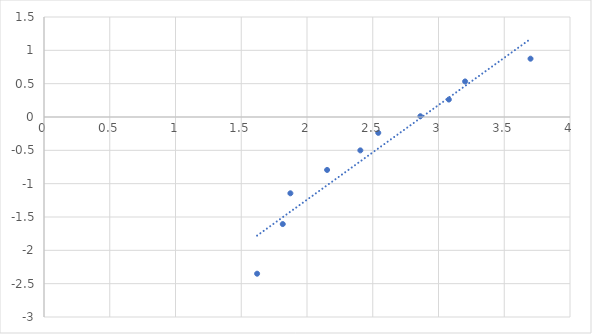
| Category | Series 0 |
|---|---|
| 1.62059217802096 | -2.351 |
| 1.81564785503453 | -1.606 |
| 1.87371264827991 | -1.144 |
| 2.15286234208468 | -0.794 |
| 2.4056972368609 | -0.501 |
| 2.54194866361078 | -0.238 |
| 2.86206557826732 | 0.012 |
| 3.07856756933071 | 0.262 |
| 3.20227254049126 | 0.533 |
| 3.69983957928917 | 0.875 |